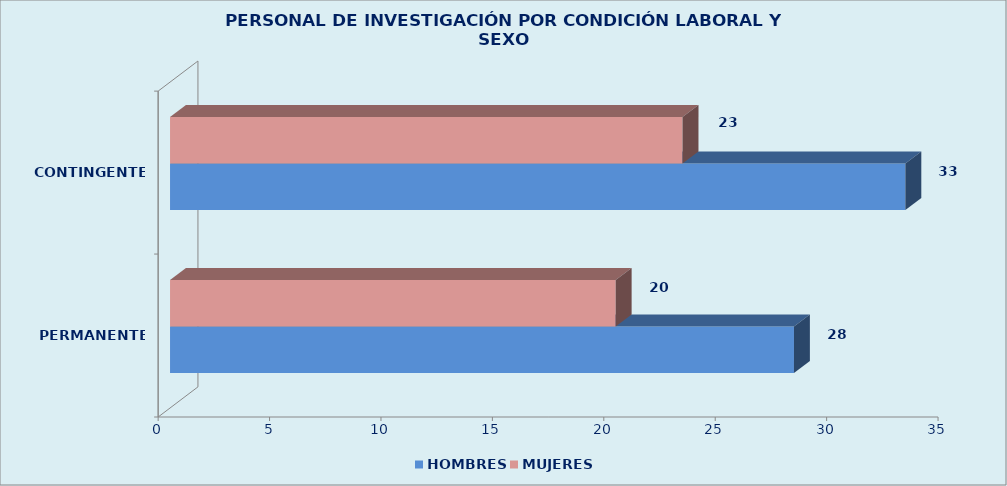
| Category | HOMBRES | MUJERES |
|---|---|---|
| PERMANENTES | 28 | 20 |
| CONTINGENTES | 33 | 23 |